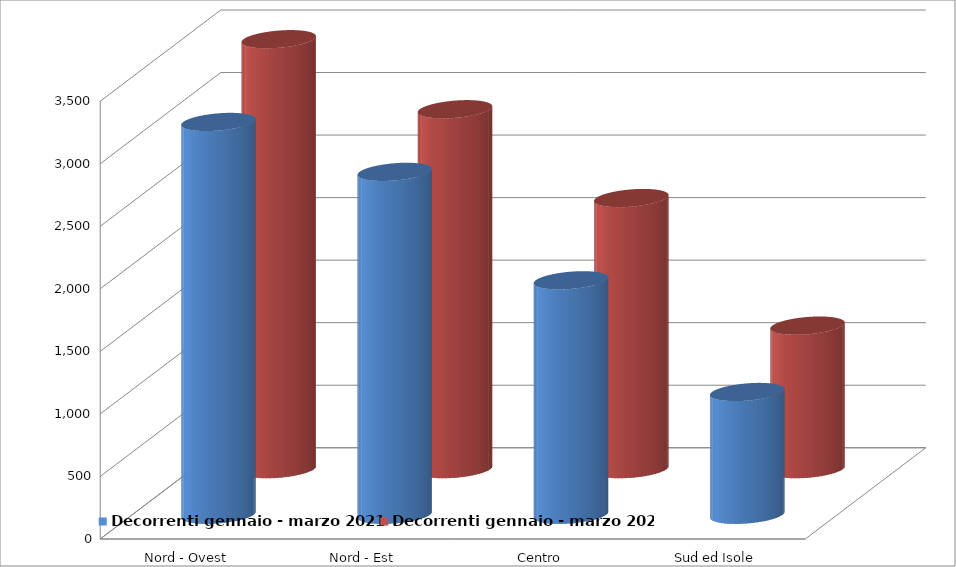
| Category | Decorrenti gennaio - marzo 2021 | Decorrenti gennaio - marzo 2020 |
|---|---|---|
| Nord - Ovest | 3141 | 3438 |
| Nord - Est | 2742 | 2878 |
| Centro | 1875 | 2168 |
| Sud ed Isole | 982 | 1148 |